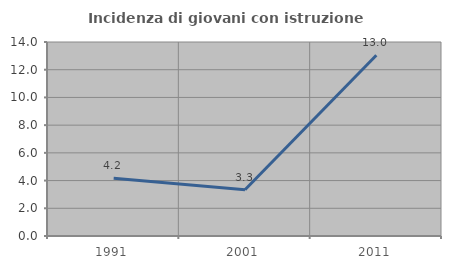
| Category | Incidenza di giovani con istruzione universitaria |
|---|---|
| 1991.0 | 4.167 |
| 2001.0 | 3.333 |
| 2011.0 | 13.043 |